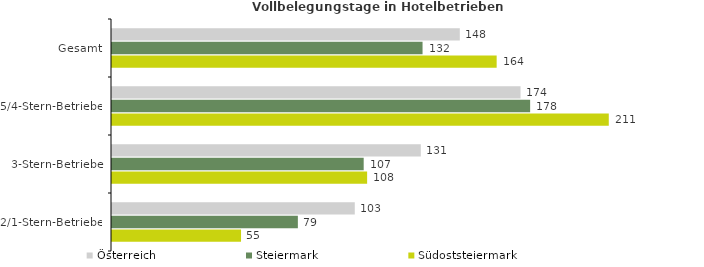
| Category | Österreich | Steiermark | Südoststeiermark |
|---|---|---|---|
| Gesamt | 147.876 | 132.038 | 163.544 |
| 5/4-Stern-Betriebe | 173.697 | 177.779 | 211.215 |
| 3-Stern-Betriebe | 131.294 | 107.011 | 108.472 |
| 2/1-Stern-Betriebe | 103.222 | 79.024 | 54.857 |